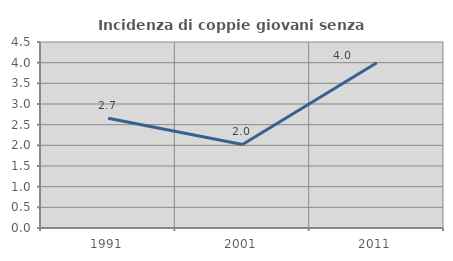
| Category | Incidenza di coppie giovani senza figli |
|---|---|
| 1991.0 | 2.655 |
| 2001.0 | 2.02 |
| 2011.0 | 4 |